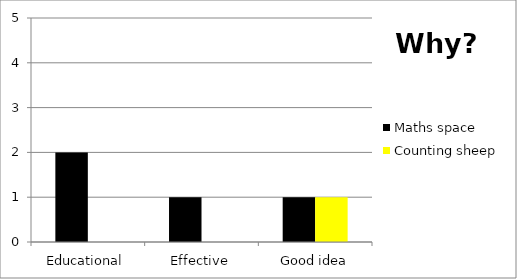
| Category | Maths space | Counting sheep |
|---|---|---|
| Educational | 2 | 0 |
| Effective | 1 | 0 |
| Good idea | 1 | 1 |